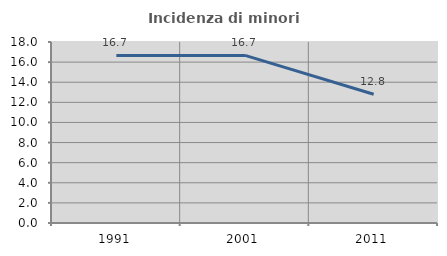
| Category | Incidenza di minori stranieri |
|---|---|
| 1991.0 | 16.667 |
| 2001.0 | 16.667 |
| 2011.0 | 12.8 |